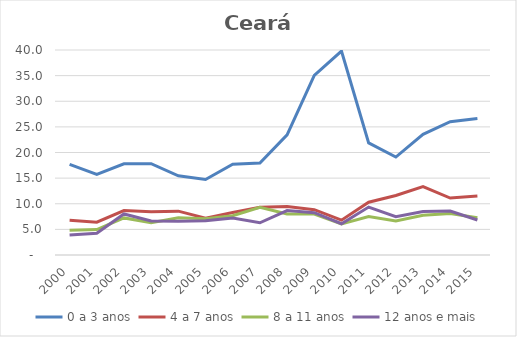
| Category | 0 a 3 anos | 4 a 7 anos | 8 a 11 anos | 12 anos e mais |
|---|---|---|---|---|
| 2000.0 | 17.689 | 6.776 | 4.831 | 3.922 |
| 2001.0 | 15.733 | 6.406 | 4.953 | 4.253 |
| 2002.0 | 17.807 | 8.672 | 7.236 | 8.006 |
| 2003.0 | 17.806 | 8.431 | 6.318 | 6.628 |
| 2004.0 | 15.45 | 8.556 | 7.263 | 6.561 |
| 2005.0 | 14.738 | 7.162 | 7.073 | 6.682 |
| 2006.0 | 17.711 | 8.294 | 7.655 | 7.194 |
| 2007.0 | 17.94 | 9.322 | 9.326 | 6.284 |
| 2008.0 | 23.438 | 9.468 | 8.006 | 8.675 |
| 2009.0 | 35.034 | 8.841 | 7.977 | 8.251 |
| 2010.0 | 39.796 | 6.795 | 6.058 | 6.095 |
| 2011.0 | 21.881 | 10.301 | 7.503 | 9.348 |
| 2012.0 | 19.115 | 11.604 | 6.662 | 7.459 |
| 2013.0 | 23.55 | 13.337 | 7.763 | 8.489 |
| 2014.0 | 26.009 | 11.11 | 8.082 | 8.591 |
| 2015.0 | 26.624 | 11.495 | 7.278 | 6.836 |